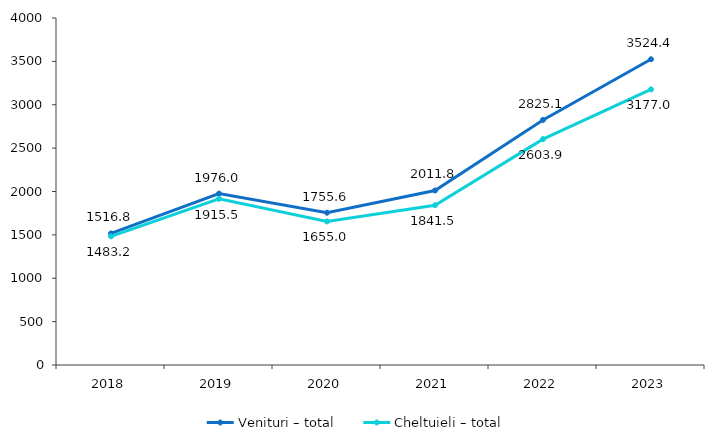
| Category | Venituri – total | Cheltuieli – total |
|---|---|---|
| 2018.0 | 1516.78 | 1483.154 |
| 2019.0 | 1976.016 | 1915.544 |
| 2020.0 | 1755.61 | 1654.954 |
| 2021.0 | 2011.809 | 1841.505 |
| 2022.0 | 2825.115 | 2603.949 |
| 2023.0 | 3524.394 | 3177.008 |